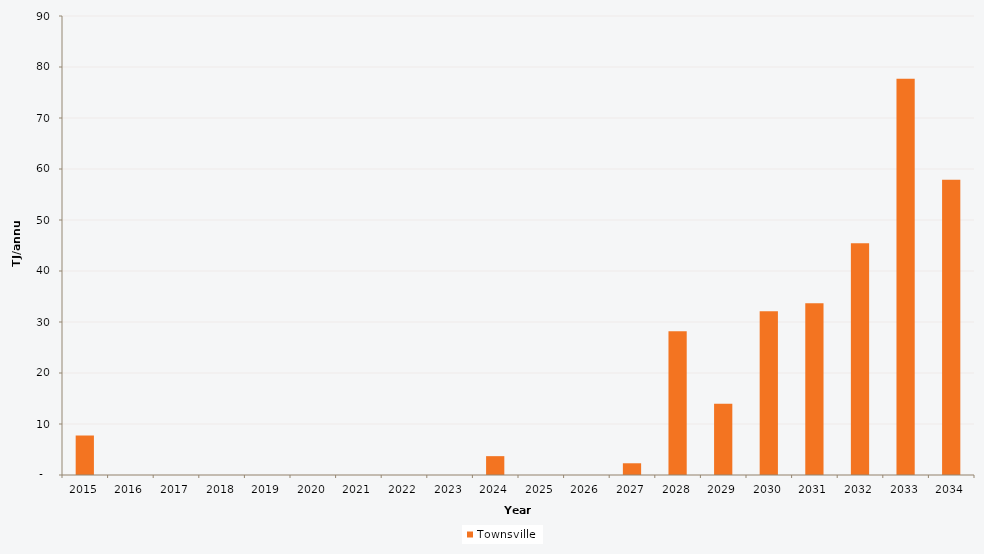
| Category | Townsville |
|---|---|
| 2015.0 | 7.743 |
| 2016.0 | 0 |
| 2017.0 | 0 |
| 2018.0 | 0 |
| 2019.0 | 0 |
| 2020.0 | 0 |
| 2021.0 | 0 |
| 2022.0 | 0 |
| 2023.0 | 0 |
| 2024.0 | 3.695 |
| 2025.0 | 0 |
| 2026.0 | 0 |
| 2027.0 | 2.299 |
| 2028.0 | 28.173 |
| 2029.0 | 13.986 |
| 2030.0 | 32.096 |
| 2031.0 | 33.656 |
| 2032.0 | 45.464 |
| 2033.0 | 77.679 |
| 2034.0 | 57.896 |